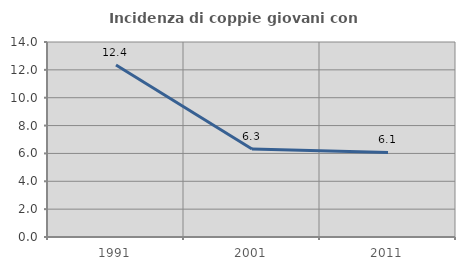
| Category | Incidenza di coppie giovani con figli |
|---|---|
| 1991.0 | 12.355 |
| 2001.0 | 6.324 |
| 2011.0 | 6.073 |